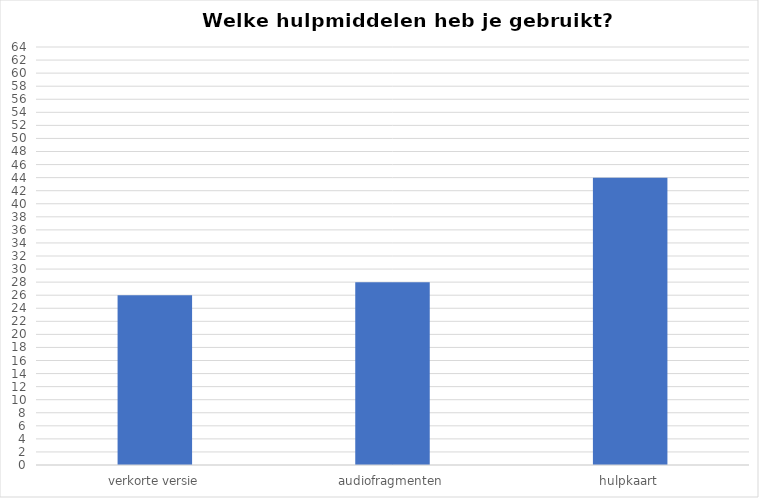
| Category | Series 0 |
|---|---|
| verkorte versie | 26 |
| audiofragmenten | 28 |
| hulpkaart | 44 |